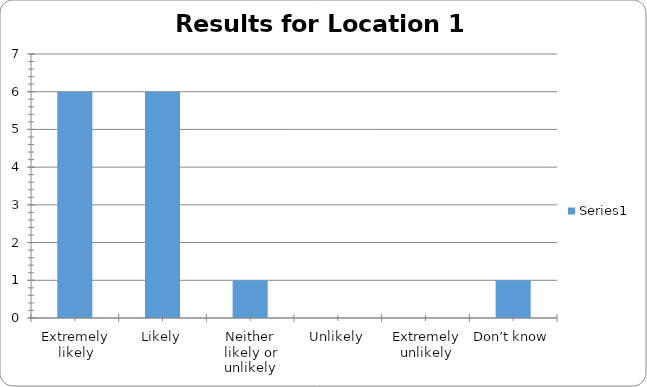
| Category | Series 0 |
|---|---|
| Extremely likely | 6 |
| Likely | 6 |
| Neither likely or unlikely | 1 |
| Unlikely | 0 |
| Extremely unlikely | 0 |
| Don’t know | 1 |